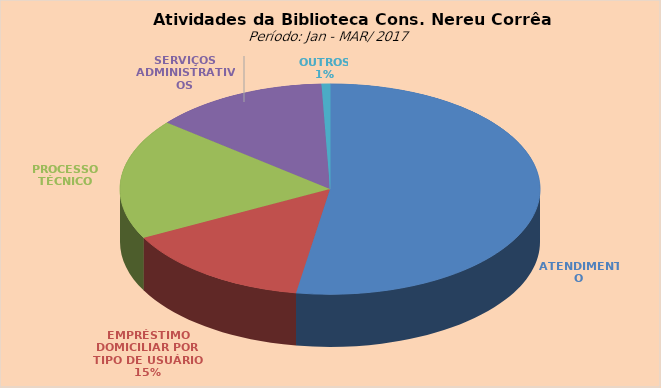
| Category | Series 0 |
|---|---|
| ATENDIMENTO | 3065 |
| EMPRÉSTIMO DOMICILIAR POR TIPO DE USUÁRIO | 860 |
| PROCESSO TÉCNICO | 1082 |
| SERVIÇOS ADMINISTRATIVOS | 784 |
| OUTROS | 38 |